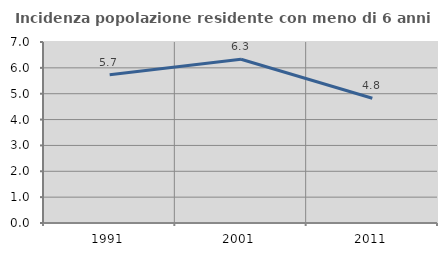
| Category | Incidenza popolazione residente con meno di 6 anni |
|---|---|
| 1991.0 | 5.731 |
| 2001.0 | 6.331 |
| 2011.0 | 4.823 |